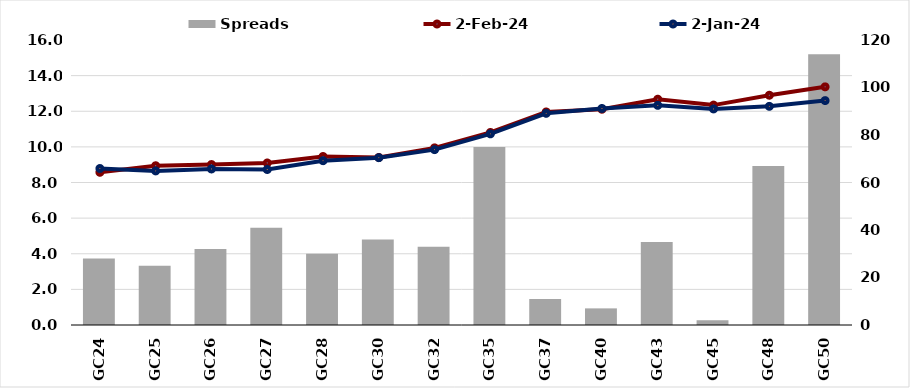
| Category |  Spreads   |
|---|---|
| GC24 | 28 |
| GC25 | 25 |
| GC26 | 32 |
| GC27 | 41 |
| GC28 | 30 |
| GC30 | 36 |
| GC32 | 33 |
| GC35 | 75 |
| GC37 | 11 |
| GC40 | 7 |
| GC43 | 35 |
| GC45 | 2 |
| GC48 | 67 |
| GC50 | 114 |